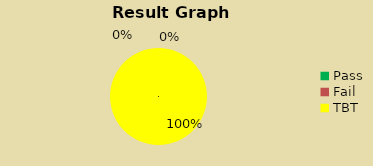
| Category | Series 0 |
|---|---|
| Pass | 0 |
| Fail | 0 |
| TBT | 43 |